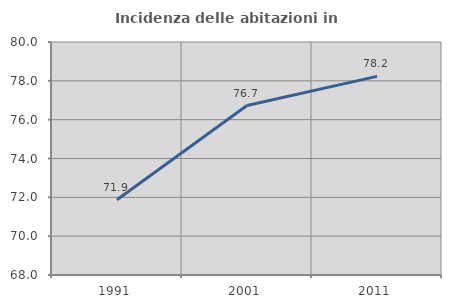
| Category | Incidenza delle abitazioni in proprietà  |
|---|---|
| 1991.0 | 71.877 |
| 2001.0 | 76.729 |
| 2011.0 | 78.23 |